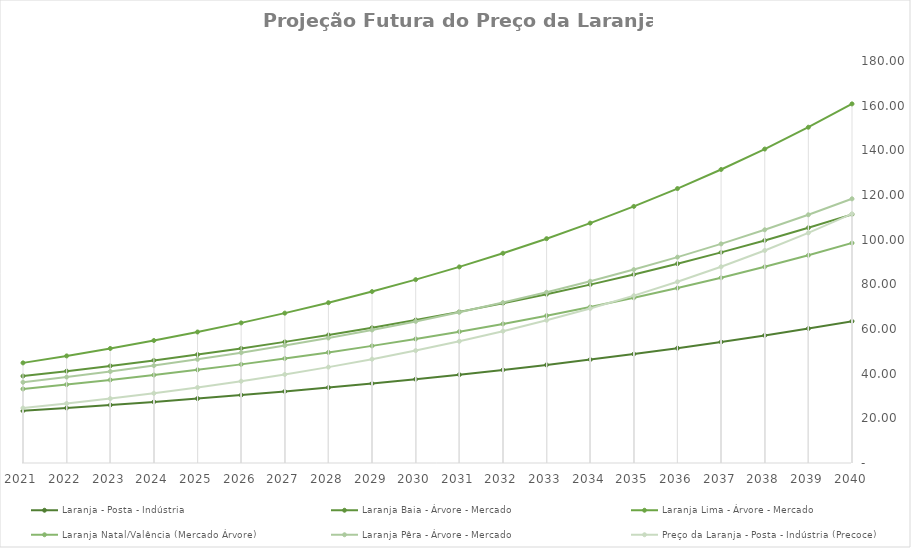
| Category | Laranja - Posta - Indústria | Laranja Baia - Árvore - Mercado | Laranja Lima - Árvore - Mercado | Laranja Natal/Valência (Mercado Árvore) | Laranja Pêra - Árvore - Mercado | Preço da Laranja - Posta - Indústria (Precoce) |
|---|---|---|---|---|---|---|
| 2021.0 | 23.373 | 38.919 | 44.83 | 33.159 | 36.167 | 24.591 |
| 2022.0 | 24.634 | 41.132 | 47.948 | 35.114 | 38.495 | 26.629 |
| 2023.0 | 25.964 | 43.472 | 51.282 | 37.185 | 40.972 | 28.835 |
| 2024.0 | 27.365 | 45.944 | 54.848 | 39.379 | 43.609 | 31.224 |
| 2025.0 | 28.842 | 48.556 | 58.662 | 41.701 | 46.415 | 33.811 |
| 2026.0 | 30.399 | 51.318 | 62.741 | 44.16 | 49.403 | 36.612 |
| 2027.0 | 32.04 | 54.236 | 67.104 | 46.765 | 52.582 | 39.645 |
| 2028.0 | 33.769 | 57.32 | 71.77 | 49.523 | 55.966 | 42.93 |
| 2029.0 | 35.592 | 60.58 | 76.76 | 52.444 | 59.568 | 46.486 |
| 2030.0 | 37.513 | 64.025 | 82.098 | 55.537 | 63.402 | 50.338 |
| 2031.0 | 39.538 | 67.666 | 87.807 | 58.812 | 67.482 | 54.508 |
| 2032.0 | 41.672 | 71.514 | 93.912 | 62.281 | 71.825 | 59.024 |
| 2033.0 | 43.921 | 75.581 | 100.443 | 65.954 | 76.448 | 63.914 |
| 2034.0 | 46.292 | 79.879 | 107.427 | 69.844 | 81.368 | 69.209 |
| 2035.0 | 48.791 | 84.422 | 114.897 | 73.964 | 86.604 | 74.943 |
| 2036.0 | 51.424 | 89.223 | 122.887 | 78.326 | 92.178 | 81.152 |
| 2037.0 | 54.2 | 94.297 | 131.432 | 82.945 | 98.111 | 87.875 |
| 2038.0 | 57.125 | 99.659 | 140.571 | 87.837 | 104.425 | 95.156 |
| 2039.0 | 60.209 | 105.327 | 150.346 | 93.018 | 111.145 | 103.039 |
| 2040.0 | 63.458 | 111.317 | 160.8 | 98.504 | 118.299 | 111.576 |